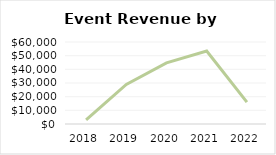
| Category | Event Revenue |
|---|---|
| 2018.0 | 3021 |
| 2019.0 | 28914 |
| 2020.0 | 44696 |
| 2021.0 | 53405 |
| 2022.0 | 15991 |